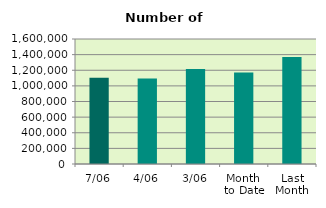
| Category | Series 0 |
|---|---|
| 7/06 | 1103670 |
| 4/06 | 1094544 |
| 3/06 | 1217594 |
| Month 
to Date | 1170333.2 |
| Last
Month | 1368600.286 |